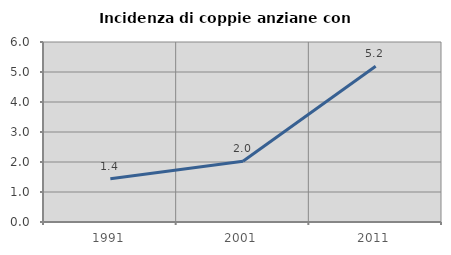
| Category | Incidenza di coppie anziane con figli |
|---|---|
| 1991.0 | 1.439 |
| 2001.0 | 2.027 |
| 2011.0 | 5.195 |